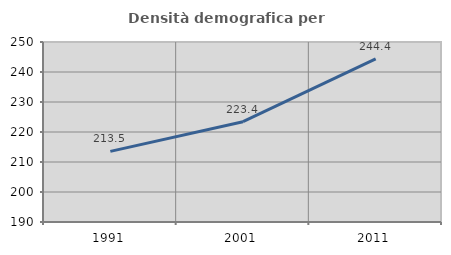
| Category | Densità demografica |
|---|---|
| 1991.0 | 213.543 |
| 2001.0 | 223.445 |
| 2011.0 | 244.369 |